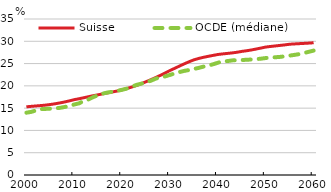
| Category | Suisse | OCDE (médiane) |
|---|---|---|
| 2000-01-01 | 15.297 | 13.98 |
| 2001-01-01 | 15.401 | 14.16 |
| 2002-01-01 | 15.489 | 14.479 |
| 2003-01-01 | 15.577 | 14.789 |
| 2004-01-01 | 15.682 | 14.828 |
| 2005-01-01 | 15.814 | 14.873 |
| 2006-01-01 | 15.982 | 14.956 |
| 2007-01-01 | 16.173 | 15.067 |
| 2008-01-01 | 16.391 | 15.258 |
| 2009-01-01 | 16.634 | 15.464 |
| 2010-01-01 | 16.904 | 15.825 |
| 2011-01-01 | 17.109 | 16.073 |
| 2012-01-01 | 17.336 | 16.646 |
| 2013-01-01 | 17.575 | 16.973 |
| 2014-01-01 | 17.801 | 17.497 |
| 2015-01-01 | 17.997 | 17.904 |
| 2016-01-01 | 18.231 | 18.278 |
| 2017-01-01 | 18.436 | 18.515 |
| 2018-01-01 | 18.632 | 18.683 |
| 2019-01-01 | 18.85 | 18.875 |
| 2020-01-01 | 19.114 | 19.123 |
| 2021-01-01 | 19.403 | 19.39 |
| 2022-01-01 | 19.724 | 19.79 |
| 2023-01-01 | 20.081 | 20.219 |
| 2024-01-01 | 20.482 | 20.492 |
| 2025-01-01 | 20.931 | 20.804 |
| 2026-01-01 | 21.379 | 21.149 |
| 2027-01-01 | 21.858 | 21.613 |
| 2028-01-01 | 22.366 | 21.951 |
| 2029-01-01 | 22.897 | 22.125 |
| 2030-01-01 | 23.447 | 22.455 |
| 2031-01-01 | 23.945 | 22.795 |
| 2032-01-01 | 24.45 | 23.1 |
| 2033-01-01 | 24.948 | 23.365 |
| 2034-01-01 | 25.414 | 23.547 |
| 2035-01-01 | 25.838 | 23.79 |
| 2036-01-01 | 26.149 | 24.034 |
| 2037-01-01 | 26.408 | 24.317 |
| 2038-01-01 | 26.629 | 24.545 |
| 2039-01-01 | 26.833 | 24.843 |
| 2040-01-01 | 27.038 | 25.182 |
| 2041-01-01 | 27.168 | 25.533 |
| 2042-01-01 | 27.281 | 25.558 |
| 2043-01-01 | 27.395 | 25.714 |
| 2044-01-01 | 27.539 | 25.756 |
| 2045-01-01 | 27.732 | 25.793 |
| 2046-01-01 | 27.875 | 25.853 |
| 2047-01-01 | 28.052 | 25.911 |
| 2048-01-01 | 28.259 | 25.989 |
| 2049-01-01 | 28.481 | 26.097 |
| 2050-01-01 | 28.708 | 26.241 |
| 2051-01-01 | 28.837 | 26.339 |
| 2052-01-01 | 28.957 | 26.419 |
| 2053-01-01 | 29.073 | 26.5 |
| 2054-01-01 | 29.196 | 26.63 |
| 2055-01-01 | 29.339 | 26.787 |
| 2056-01-01 | 29.408 | 26.949 |
| 2057-01-01 | 29.47 | 27.122 |
| 2058-01-01 | 29.529 | 27.377 |
| 2059-01-01 | 29.593 | 27.64 |
| 2060-01-01 | 29.672 | 27.91 |